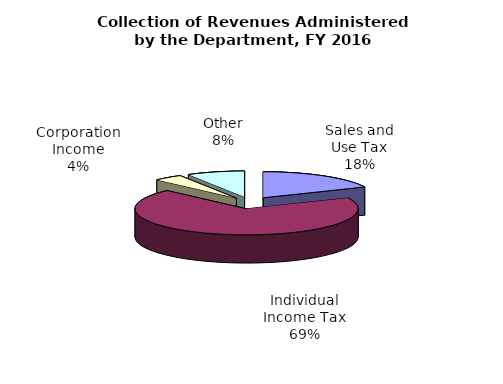
| Category | Series 0 |
|---|---|
| Sales and Use Tax | 3295853000 |
| Individual Income Tax | 12555624000 |
| Corporation Income | 764948000 |
| Other | 1524692000 |